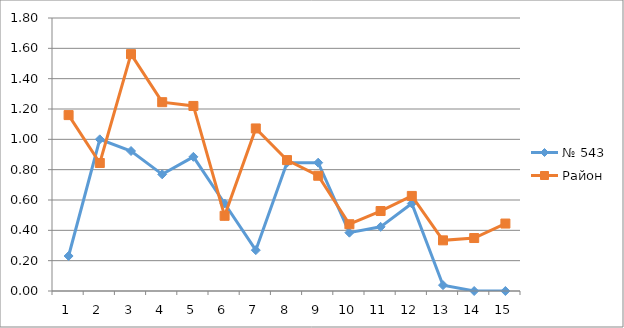
| Category | № 543 | Район |
|---|---|---|
| 0 | 0.231 | 1.16 |
| 1 | 1 | 0.844 |
| 2 | 0.923 | 1.562 |
| 3 | 0.769 | 1.245 |
| 4 | 0.885 | 1.22 |
| 5 | 0.577 | 0.496 |
| 6 | 0.269 | 1.072 |
| 7 | 0.846 | 0.863 |
| 8 | 0.846 | 0.76 |
| 9 | 0.385 | 0.44 |
| 10 | 0.423 | 0.527 |
| 11 | 0.577 | 0.627 |
| 12 | 0.038 | 0.334 |
| 13 | 0 | 0.349 |
| 14 | 0 | 0.445 |